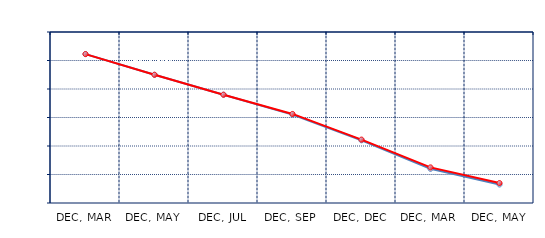
| Category | Series 0 | Series 1 |
|---|---|---|
| DEC, MAR | -7.75 | -7.75 |
| DEC, MAY | -15 | -15 |
| DEC, JUL | -22 | -22 |
| DEC, SEP | -29 | -28.75 |
| DEC, DEC | -38 | -37.75 |
| DEC, MAR | -48 | -47.5 |
| DEC, MAY | -53.5 | -53 |